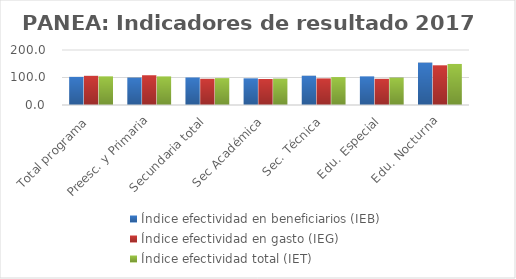
| Category | Índice efectividad en beneficiarios (IEB) | Índice efectividad en gasto (IEG)  | Índice efectividad total (IET) |
|---|---|---|---|
| Total programa | 102.277 | 106.094 | 104.185 |
| Preesc. y Primaria | 99.794 | 108.211 | 104.003 |
| Secundaria total | 100.119 | 95.321 | 97.72 |
| Sec Académica | 96.971 | 94.632 | 95.802 |
| Sec. Técnica | 106.451 | 96.724 | 101.587 |
| Edu. Especial | 104.141 | 95.211 | 99.676 |
| Edu. Nocturna | 154.145 | 144.353 | 149.249 |